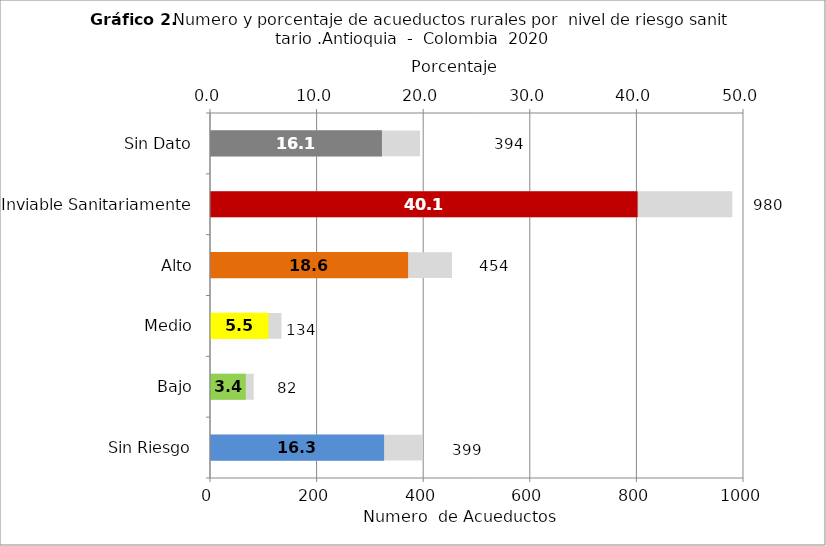
| Category | Número de Sistemas |
|---|---|
| Sin Riesgo | 399 |
| Bajo | 82 |
| Medio | 134 |
| Alto | 454 |
| Inviable Sanitariamente | 980 |
| Sin Dato | 394 |